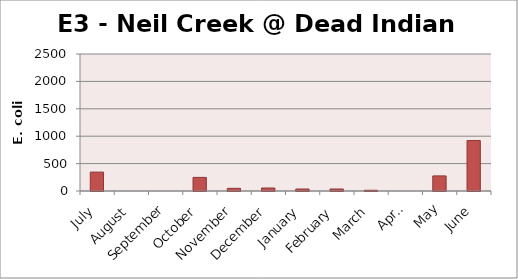
| Category | E. coli MPN |
|---|---|
| July | 344.8 |
| August | 0 |
| September | 0 |
| October | 248.1 |
| November | 48.7 |
| December | 54.5 |
| January | 36.4 |
| February | 36.9 |
| March | 13.4 |
| April | 0 |
| May | 275.5 |
| June | 920.8 |